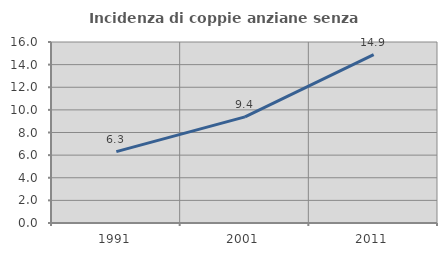
| Category | Incidenza di coppie anziane senza figli  |
|---|---|
| 1991.0 | 6.305 |
| 2001.0 | 9.383 |
| 2011.0 | 14.879 |